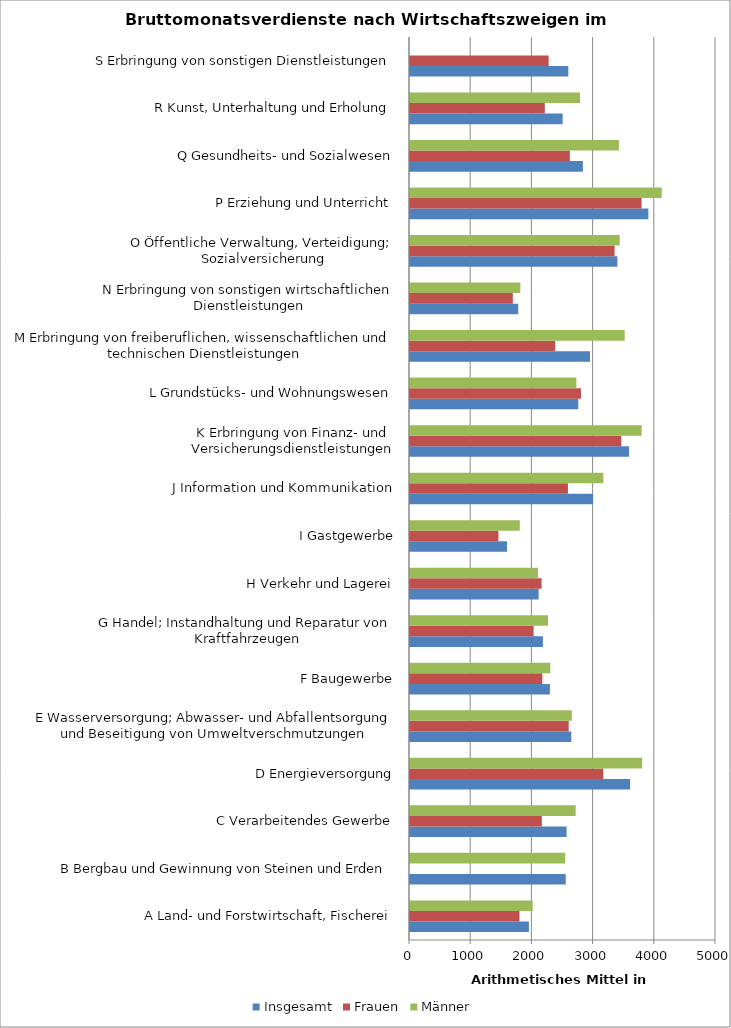
| Category | Insgesamt | Frauen | Männer |
|---|---|---|---|
| A Land- und Forstwirtschaft, Fischerei | 1943 | 1789 | 2005 |
| B Bergbau und Gewinnung von Steinen und Erden | 2545 | 0 | 2537 |
| C Verarbeitendes Gewerbe | 2559 | 2154 | 2707 |
| D Energieversorgung | 3597 | 3159 | 3793 |
| E Wasserversorgung; Abwasser- und Abfallentsorgung und Beseitigung von Umweltverschmutzungen | 2635 | 2593 | 2644 |
| F Baugewerbe | 2286 | 2162 | 2293 |
| G Handel; Instandhaltung und Reparatur von Kraftfahrzeugen | 2171 | 2020 | 2255 |
| H Verkehr und Lagerei | 2102 | 2150 | 2092 |
| I Gastgewerbe | 1585 | 1445 | 1794 |
| J Information und Kommunikation | 2991 | 2581 | 3159 |
| K Erbringung von Finanz- und Versicherungsdienstleistungen | 3580 | 3453 | 3786 |
| L Grundstücks- und Wohnungswesen | 2750 | 2794 | 2718 |
| M Erbringung von freiberuflichen, wissenschaftlichen und technischen Dienstleistungen | 2941 | 2373 | 3509 |
| N Erbringung von sonstigen wirtschaftlichen Dienstleistungen | 1768 | 1680 | 1803 |
| O Öffentliche Verwaltung, Verteidigung; Sozialversicherung | 3388 | 3343 | 3427 |
| P Erziehung und Unterricht | 3895 | 3784 | 4114 |
| Q Gesundheits- und Sozialwesen | 2825 | 2612 | 3414 |
| R Kunst, Unterhaltung und Erholung | 2494 | 2203 | 2778 |
| S Erbringung von sonstigen Dienstleistungen | 2587 | 2265 | 0 |